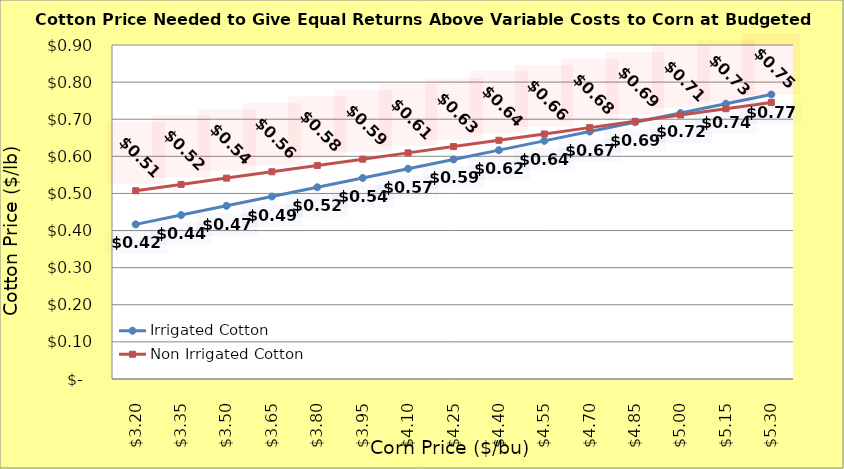
| Category | Irrigated Cotton | Non Irrigated Cotton |
|---|---|---|
| 3.2 | 0.417 | 0.507 |
| 3.35 | 0.442 | 0.524 |
| 3.5 | 0.467 | 0.541 |
| 3.65 | 0.492 | 0.558 |
| 3.8 | 0.517 | 0.575 |
| 3.9499999999999997 | 0.542 | 0.592 |
| 4.1 | 0.567 | 0.609 |
| 4.25 | 0.592 | 0.626 |
| 4.4 | 0.617 | 0.643 |
| 4.550000000000001 | 0.642 | 0.66 |
| 4.700000000000001 | 0.667 | 0.677 |
| 4.850000000000001 | 0.692 | 0.694 |
| 5.000000000000002 | 0.717 | 0.711 |
| 5.150000000000002 | 0.742 | 0.728 |
| 5.3000000000000025 | 0.767 | 0.745 |